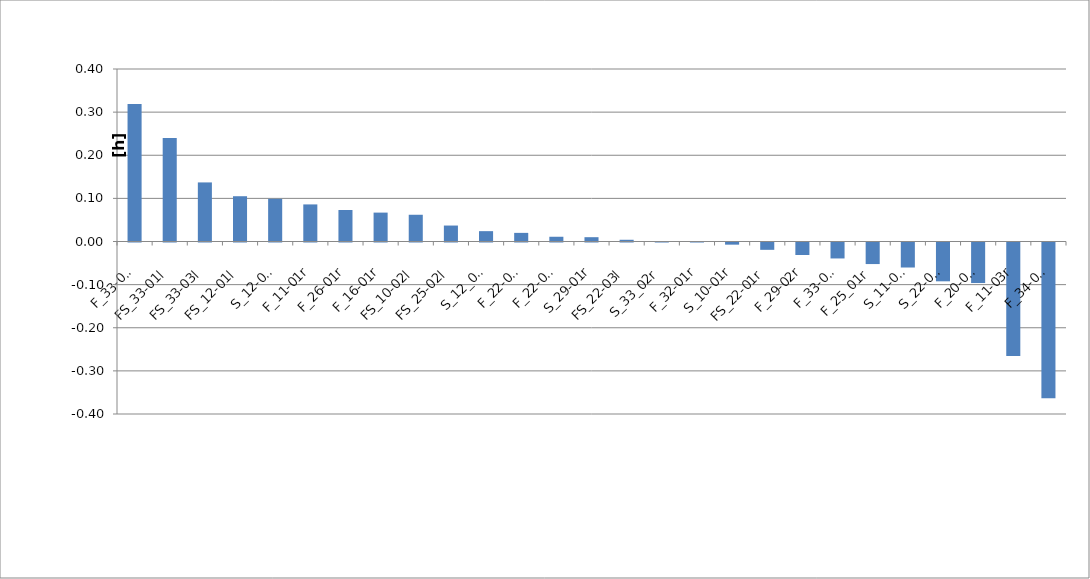
| Category | Series 0 |
|---|---|
| F_33-04l | 0.319 |
| FS_33-01l | 0.24 |
| FS_33-03l | 0.137 |
| FS_12-01l | 0.105 |
| S_12-03l | 0.099 |
| F_11-01r | 0.086 |
| F_26-01r | 0.073 |
| F_16-01r | 0.067 |
| FS_10-02l | 0.062 |
| FS_25-02l | 0.037 |
| S_12_02l | 0.024 |
| F_22-05l | 0.02 |
| F_22-04l | 0.011 |
| S_29-01r | 0.01 |
| FS_22-03l | 0.004 |
| S_33_02r | 0.001 |
| F_32-01r | 0 |
| S_10-01r | -0.005 |
| FS_22-01r | -0.017 |
| F_29-02r | -0.029 |
| F_33-05l | -0.037 |
| F_25_01r | -0.05 |
| S_11-02l | -0.058 |
| S_22-02l | -0.09 |
| F_20-01l | -0.094 |
| F_11-03r | -0.263 |
| F_34-01l | -0.361 |